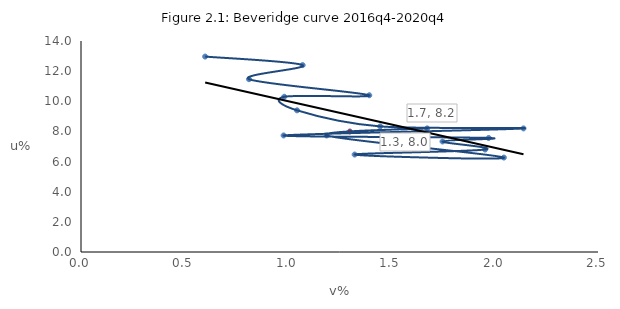
| Category | Unemployment rate |
|---|---|
| 0.6003216676848654 | 12.967 |
| 1.0719141459229091 | 12.4 |
| 0.8124422469968439 | 11.467 |
| 1.393849044636956 | 10.4 |
| 0.9828009828009828 | 10.3 |
| 1.044678693943308 | 9.4 |
| 1.446831472800243 | 8.333 |
| 2.1396418395282573 | 8.2 |
| 0.9797008300002312 | 7.733 |
| 1.971480301232394 | 7.567 |
| 1.7481382797021248 | 7.333 |
| 1.9543884655446522 | 6.8 |
| 1.3233111832042588 | 6.467 |
| 2.044892470054591 | 6.267 |
| 1.1878159917007003 | 7.733 |
| 1.6741280137162213 | 8.2 |
| 1.3 | 8 |